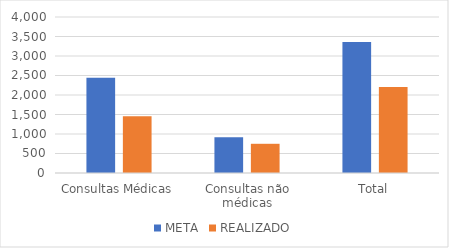
| Category | META | REALIZADO |
|---|---|---|
| Consultas Médicas | 2442 | 1458 |
| Consultas não médicas | 916 | 749 |
| Total | 3358 | 2207 |